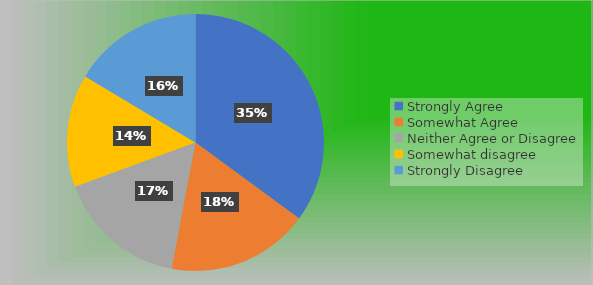
| Category | Series 0 |
|---|---|
| Strongly Agree | 47 |
| Somewhat Agree | 24 |
| Neither Agree or Disagree | 22 |
| Somewhat disagree | 19 |
| Strongly Disagree | 22 |